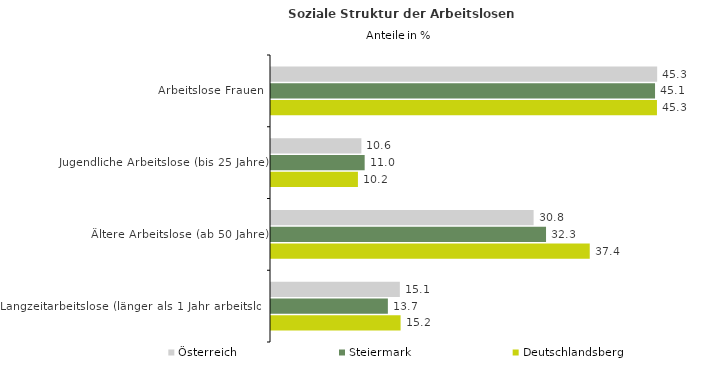
| Category | Österreich | Steiermark | Deutschlandsberg |
|---|---|---|---|
| Arbeitslose Frauen | 45.325 | 45.075 | 45.3 |
| Jugendliche Arbeitslose (bis 25 Jahre) | 10.608 | 10.993 | 10.203 |
| Ältere Arbeitslose (ab 50 Jahre) | 30.822 | 32.281 | 37.411 |
| Langzeitarbeitslose (länger als 1 Jahr arbeitslos) | 15.122 | 13.717 | 15.21 |